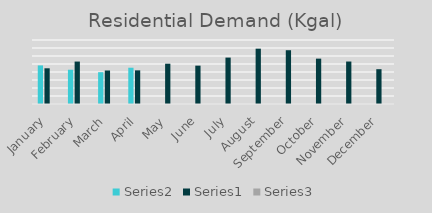
| Category | Series 1 | Series 0 | Series 2 |
|---|---|---|---|
| January | 48220 | 44639 | 1.08 |
| February | 42842.474 | 53057 | 0.807 |
| March | 39765.159 | 41882 | 0.949 |
| April | 45340.468 | 42057.867 | 1.078 |
| May | 0 | 50377.601 | 0 |
| June | 0 | 47943.133 | 0 |
| July | 0 | 58007.249 | 0 |
| August | 0 | 69155.328 | 0 |
| September | 0 | 67226.815 | 0 |
| October | 0 | 56697.11 | 0 |
| November | 0 | 53097.198 | 0 |
| December | 0 | 43519.04 | 0 |